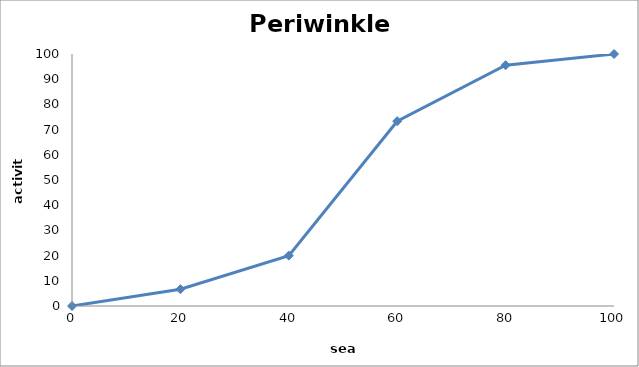
| Category | % active |
|---|---|
| 0.0 | 0 |
| 20.0 | 6.667 |
| 40.0 | 20 |
| 60.0 | 73.333 |
| 80.0 | 95.556 |
| 100.0 | 100 |